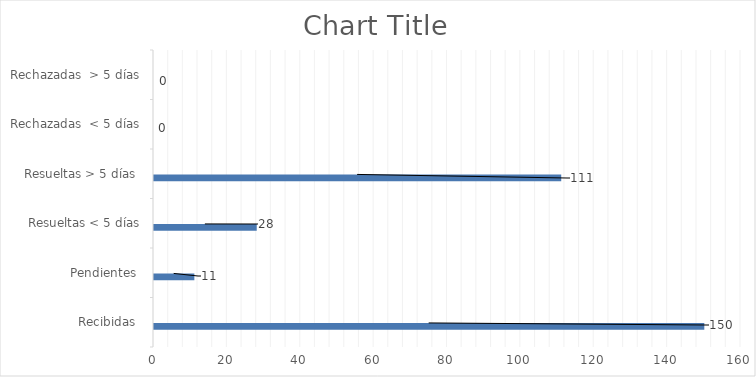
| Category | Física | PORTAL SAIP | 311 | Otras |
|---|---|---|---|---|
| Recibidas  | 0 | 150 | 0 | 0 |
| Pendientes  | 0 | 11 | 0 | 0 |
| Resueltas < 5 días | 0 | 28 | 0 | 0 |
| Resueltas > 5 días  | 0 | 111 | 0 | 0 |
| Rechazadas  < 5 días | 0 | 0 | 0 | 0 |
| Rechazadas  > 5 días | 0 | 0 | 0 | 0 |